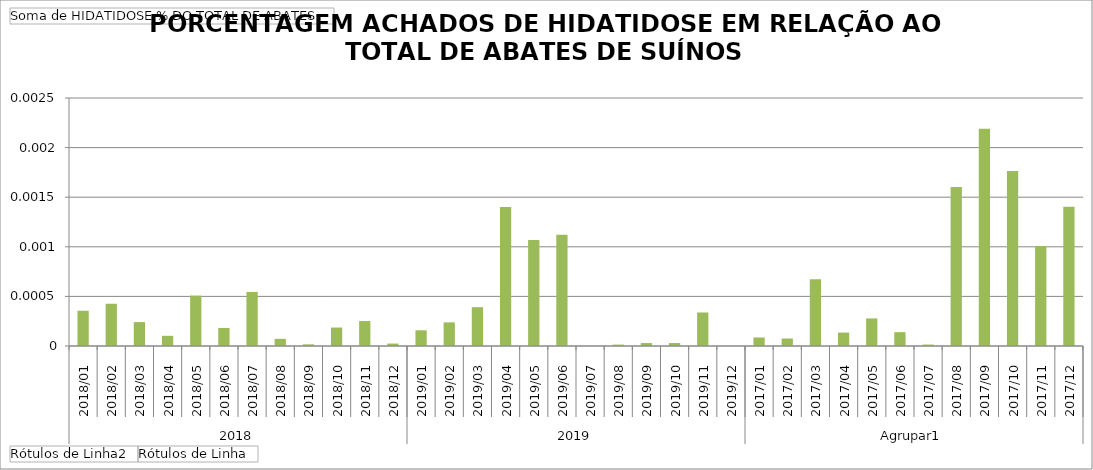
| Category | Total |
|---|---|
| 0 | 0 |
| 1 | 0 |
| 2 | 0 |
| 3 | 0 |
| 4 | 0.001 |
| 5 | 0 |
| 6 | 0.001 |
| 7 | 0 |
| 8 | 0 |
| 9 | 0 |
| 10 | 0 |
| 11 | 0 |
| 12 | 0 |
| 13 | 0 |
| 14 | 0 |
| 15 | 0.001 |
| 16 | 0.001 |
| 17 | 0.001 |
| 18 | 0 |
| 19 | 0 |
| 20 | 0 |
| 21 | 0 |
| 22 | 0 |
| 23 | 0 |
| 24 | 0 |
| 25 | 0 |
| 26 | 0.001 |
| 27 | 0 |
| 28 | 0 |
| 29 | 0 |
| 30 | 0 |
| 31 | 0.002 |
| 32 | 0.002 |
| 33 | 0.002 |
| 34 | 0.001 |
| 35 | 0.001 |